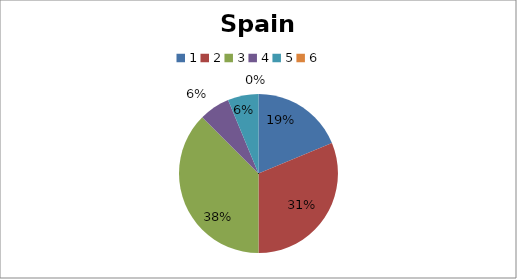
| Category | Spain |
|---|---|
| 0 | 6 |
| 1 | 10 |
| 2 | 12 |
| 3 | 2 |
| 4 | 2 |
| 5 | 0 |